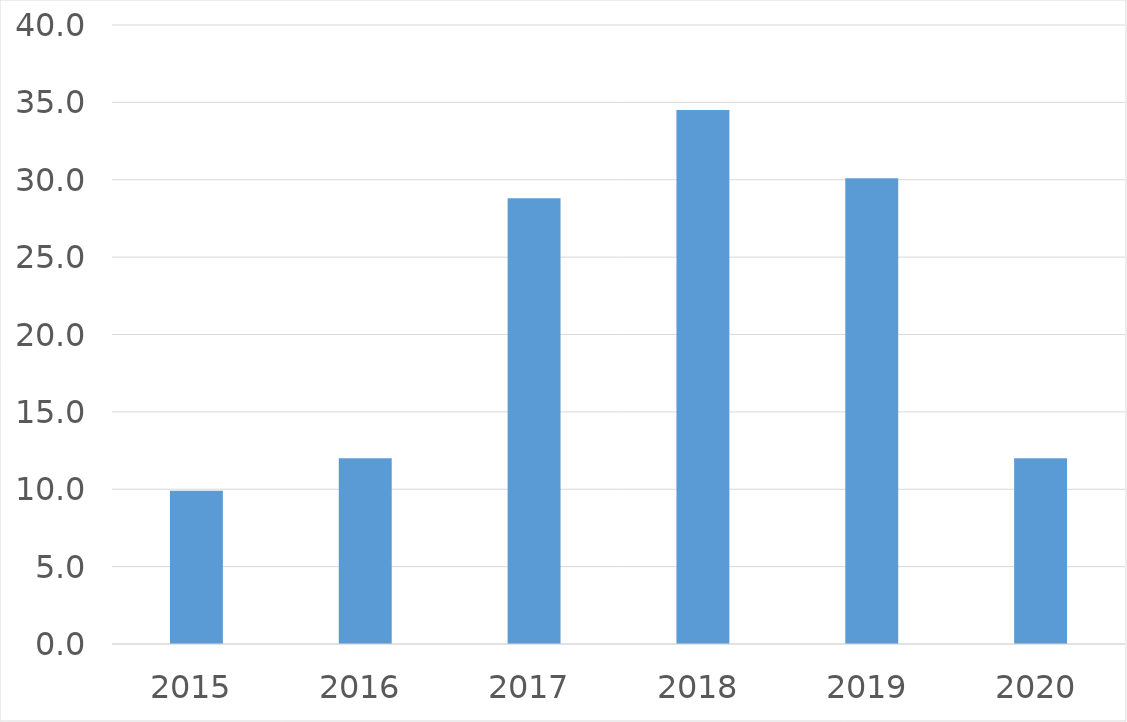
| Category | Series 0 |
|---|---|
| 2015 | 9.9 |
| 2016 | 12 |
| 2017 | 28.8 |
| 2018 | 34.5 |
| 2019 | 30.1 |
| 2020 | 12 |